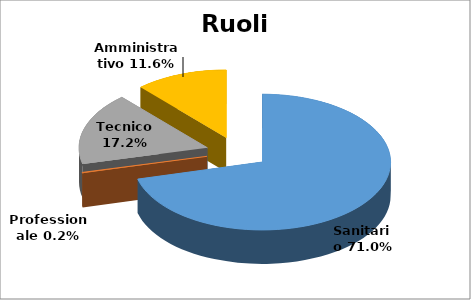
| Category | Series 0 |
|---|---|
| Sanitario | 0.71 |
| Professionale | 0.002 |
| Tecnico | 0.172 |
| Amministrativo | 0.116 |